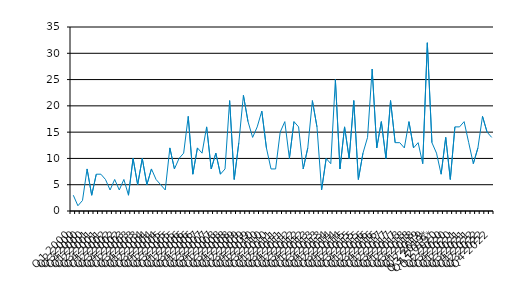
| Category | Series 0 |
|---|---|
| Q1 2000 | 3 |
| Q2 2000 | 1 |
| Q3 2000 | 2 |
| Q4 2000 | 8 |
| Q1 2001 | 3 |
| Q2 2001 | 7 |
| Q3 2001 | 7 |
| Q4 2001 | 6 |
| Q1 2002 | 4 |
| Q2 2002 | 6 |
| Q3 2002 | 4 |
| Q4 2002 | 6 |
| Q1 2003 | 3 |
| Q2 2003 | 10 |
| Q3 2003 | 5 |
| Q4 2003 | 10 |
| Q1 2004 | 5 |
| Q2 2004 | 8 |
| Q3 2004 | 6 |
| Q4 2004 | 5 |
| Q1 2005 | 4 |
| Q2 2005 | 12 |
| Q3 2005 | 8 |
| Q4 2005 | 10 |
| Q1 2006 | 11 |
| Q2 2006 | 18 |
| Q3 2006 | 7 |
| Q4 2006 | 12 |
| Q1 2007 | 11 |
| Q2 2007 | 16 |
| Q3 2007 | 8 |
| Q4 2007 | 11 |
| Q1 2008 | 7 |
| Q2 2008 | 8 |
| Q3 2008 | 21 |
| Q4 2008 | 6 |
| Q1 2009 | 13 |
| Q2 2009 | 22 |
| Q3 2009 | 17 |
| Q4 2009 | 14 |
| Q1 2010 | 16 |
| Q2 2010 | 19 |
| Q3 2010 | 12 |
| Q4 2010 | 8 |
| Q1 2011 | 8 |
| Q2 2011 | 15 |
| Q3 2011 | 17 |
| Q4 2011 | 10 |
| Q1 2012 | 17 |
| Q2 2012 | 16 |
| Q3 2012 | 8 |
| Q4 2012 | 12 |
| Q1 2013 | 21 |
| Q2 2013 | 16 |
| Q3 2013 | 4 |
| Q4 2013 | 10 |
| Q1 2014 | 9 |
| Q2 2014 | 25 |
| Q3 2014 | 8 |
| Q4 2014 | 16 |
| Q1 2015 | 10 |
| Q2 2015 | 21 |
| Q3 2015 | 6 |
| Q4 2015 | 11 |
| Q1 2016 | 14 |
| Q2 2016 | 27 |
| Q3 2016 | 12 |
| Q4 2016 | 17 |
| Q1 2017 | 10 |
| Q2 2017 | 21 |
| Q3 2017 | 13 |
| Q4 2017 | 13 |
| Q1 2018 | 12 |
| Q2 2018 | 17 |
| Q3 2018 | 12 |
| Q4 2018 | 13 |
| Q1 2019 | 9 |
| Q2 2019 | 32 |
| Q3 2019* | 13 |
| Q4 2019* | 11 |
| Q1 2020 | 7 |
| Q2 2020 | 14 |
| Q3 2020 | 6 |
| Q4 2020 | 16 |
| Q1 2021 | 16 |
| Q2 2021 | 17 |
| Q3 2021 | 13 |
| Q4 2021 | 9 |
| Q1 2022 | 12 |
| Q2 2022 | 18 |
| Q3 2022 | 15 |
| Q4 2022 | 14 |